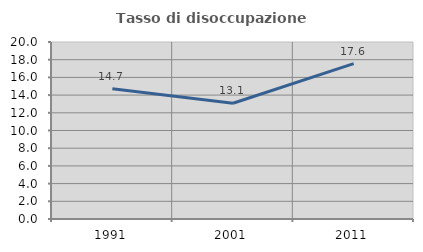
| Category | Tasso di disoccupazione giovanile  |
|---|---|
| 1991.0 | 14.722 |
| 2001.0 | 13.084 |
| 2011.0 | 17.553 |